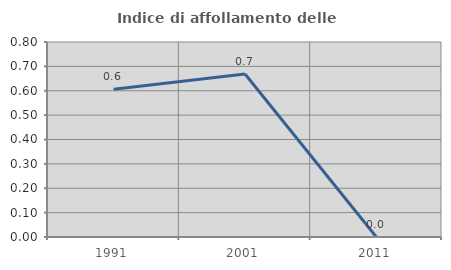
| Category | Indice di affollamento delle abitazioni  |
|---|---|
| 1991.0 | 0.606 |
| 2001.0 | 0.669 |
| 2011.0 | 0 |